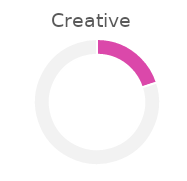
| Category | Creative |
|---|---|
| 0 | 0.2 |
| 1 | 0.8 |